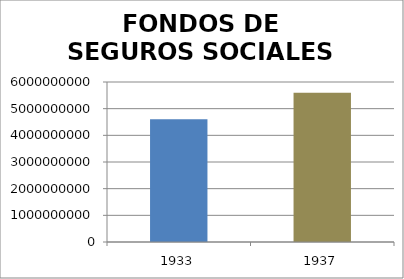
| Category | FONDOS DE SEGUROS SOCIALES |
|---|---|
| 1933.0 | 4600000000 |
| 1937.0 | 5600000000 |